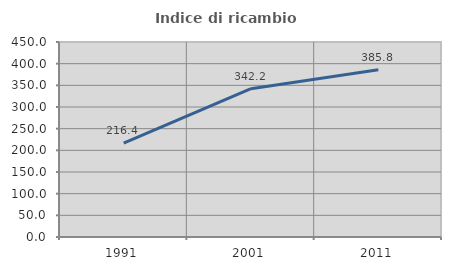
| Category | Indice di ricambio occupazionale  |
|---|---|
| 1991.0 | 216.447 |
| 2001.0 | 342.188 |
| 2011.0 | 385.827 |